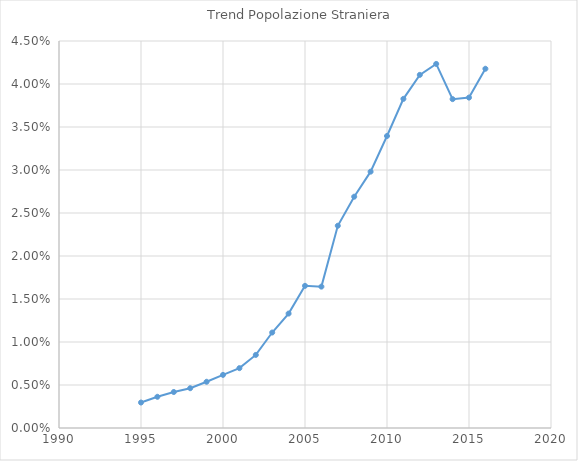
| Category | Series 0 |
|---|---|
| 1995.0 | 0.003 |
| 1996.0 | 0.004 |
| 1997.0 | 0.004 |
| 1998.0 | 0.005 |
| 1999.0 | 0.005 |
| 2000.0 | 0.006 |
| 2001.0 | 0.007 |
| 2002.0 | 0.008 |
| 2003.0 | 0.011 |
| 2004.0 | 0.013 |
| 2005.0 | 0.017 |
| 2006.0 | 0.016 |
| 2007.0 | 0.024 |
| 2008.0 | 0.027 |
| 2009.0 | 0.03 |
| 2010.0 | 0.034 |
| 2011.0 | 0.038 |
| 2012.0 | 0.041 |
| 2013.0 | 0.042 |
| 2014.0 | 0.038 |
| 2015.0 | 0.038 |
| 2016.0 | 0.042 |